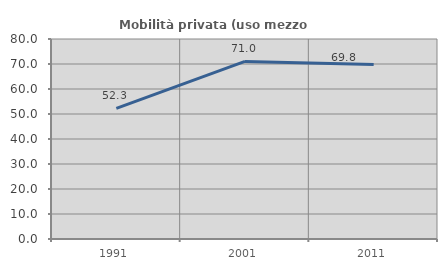
| Category | Mobilità privata (uso mezzo privato) |
|---|---|
| 1991.0 | 52.261 |
| 2001.0 | 71.027 |
| 2011.0 | 69.811 |